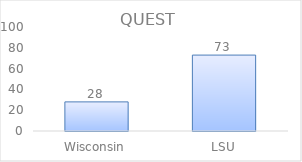
| Category | Series 0 |
|---|---|
| Wisconsin | 28 |
| LSU | 73 |